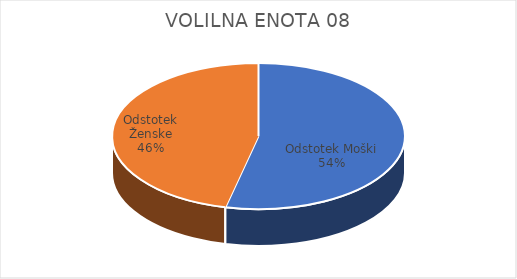
| Category | VOLILNA ENOTA 08 | #REF! | Slovenija skupaj |
|---|---|---|---|
| Odstotek Moški | 7.1 |  | 7.6 |
| Odstotek Ženske | 6.14 |  | 7.35 |